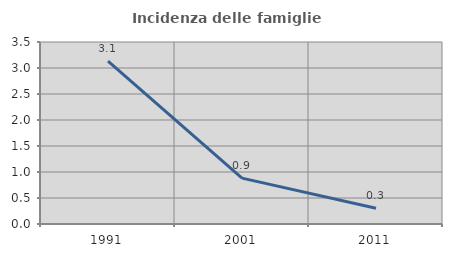
| Category | Incidenza delle famiglie numerose |
|---|---|
| 1991.0 | 3.134 |
| 2001.0 | 0.882 |
| 2011.0 | 0.301 |